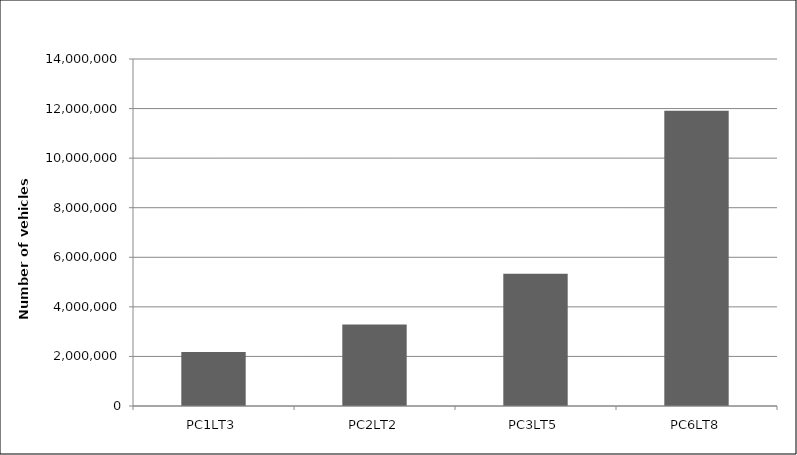
| Category | Number of Vehicles Removed from Fleet Corresponding to Emissions Reductions from Baseline Alternative |
|---|---|
| PC1LT3 | 2177044.037 |
| PC2LT2 | 3289437.784 |
| PC3LT5 | 5333779.94 |
| PC6LT8 | 11913246.861 |